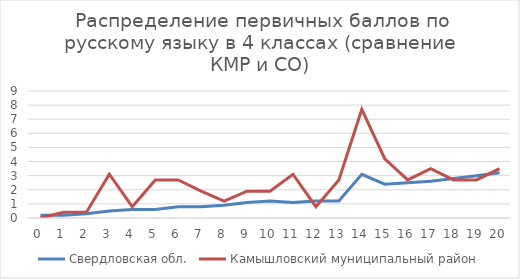
| Category | Свердловская обл. | Камышловский муниципальный район |
|---|---|---|
| 0.0 | 0.2 | 0 |
| 1.0 | 0.2 | 0.4 |
| 2.0 | 0.3 | 0.4 |
| 3.0 | 0.5 | 3.1 |
| 4.0 | 0.6 | 0.8 |
| 5.0 | 0.6 | 2.7 |
| 6.0 | 0.8 | 2.7 |
| 7.0 | 0.8 | 1.9 |
| 8.0 | 0.9 | 1.2 |
| 9.0 | 1.1 | 1.9 |
| 10.0 | 1.2 | 1.9 |
| 11.0 | 1.1 | 3.1 |
| 12.0 | 1.2 | 0.8 |
| 13.0 | 1.2 | 2.7 |
| 14.0 | 3.1 | 7.7 |
| 15.0 | 2.4 | 4.2 |
| 16.0 | 2.5 | 2.7 |
| 17.0 | 2.6 | 3.5 |
| 18.0 | 2.8 | 2.7 |
| 19.0 | 3 | 2.7 |
| 20.0 | 3.2 | 3.5 |